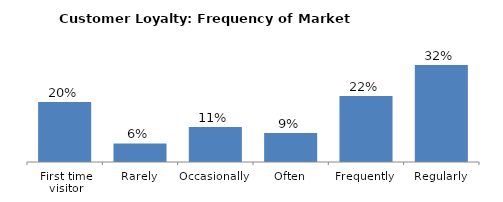
| Category | Series 0 |
|---|---|
| First time visitor | 0.196 |
| Rarely | 0.061 |
| Occasionally | 0.115 |
| Often | 0.095 |
| Frequently | 0.216 |
| Regularly | 0.318 |